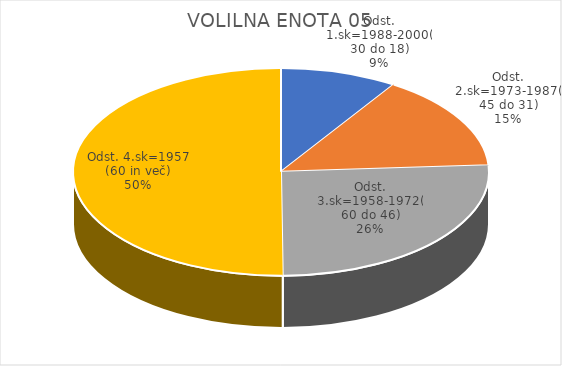
| Category | VOLILNA ENOTA 05 |
|---|---|
| Odst. 1.sk=1988-2000(30 do 18) | 2.45 |
| Odst. 2.sk=1973-1987(45 do 31) | 4 |
| Odst. 3.sk=1958-1972(60 do 46) | 6.96 |
| Odst. 4.sk=1957 (60 in več) | 13.48 |